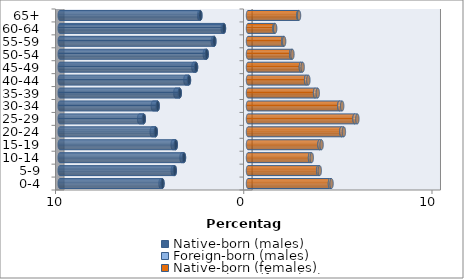
| Category | Native-born (males) | Foreign-born (males) | Native-born (females) | Foreign-born (females) |
|---|---|---|---|---|
| 0-4 | -4.544 | -0.101 | 4.355 | 0.083 |
| 5-9 | -3.891 | -0.104 | 3.732 | 0.08 |
| 10-14 | -3.402 | -0.128 | 3.295 | 0.091 |
| 15-19 | -3.837 | -0.163 | 3.8 | 0.108 |
| 20-24 | -4.9 | -0.212 | 4.961 | 0.133 |
| 25-29 | -5.534 | -0.248 | 5.66 | 0.15 |
| 30-34 | -4.799 | -0.255 | 4.85 | 0.152 |
| 35-39 | -3.625 | -0.234 | 3.563 | 0.142 |
| 40-44 | -3.137 | -0.187 | 3.088 | 0.119 |
| 45-49 | -2.761 | -0.14 | 2.811 | 0.093 |
| 50-54 | -2.194 | -0.1 | 2.293 | 0.067 |
| 55-59 | -1.789 | -0.079 | 1.87 | 0.05 |
| 60-64 | -1.278 | -0.066 | 1.405 | 0.039 |
| 65+ | -2.531 | -0.063 | 2.676 | 0.034 |